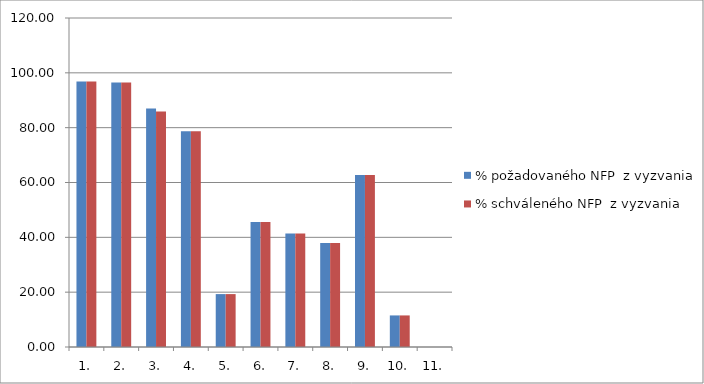
| Category | % požadovaného NFP  z vyzvania | % schváleného NFP  z vyzvania |
|---|---|---|
| 1. | 96.864 | 96.864 |
| 2. | 96.46 | 96.46 |
| 3. | 87.002 | 85.927 |
| 4. | 78.666 | 78.666 |
| 5. | 19.298 | 19.298 |
| 6. | 45.593 | 45.593 |
| 7. | 41.419 | 41.419 |
| 8. | 37.891 | 37.891 |
| 9. | 62.721 | 62.721 |
| 10. | 11.517 | 11.517 |
| 11. | 0 | 0 |